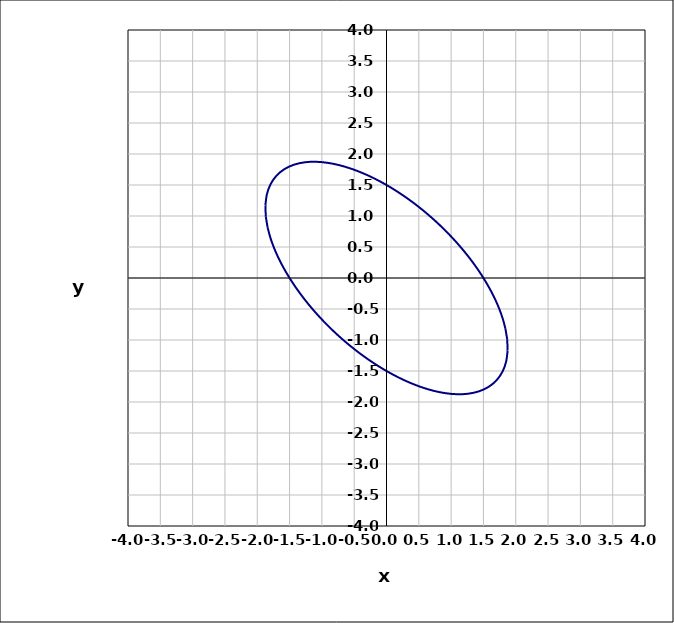
| Category | Series 0 |
|---|---|
| -1.5 | 0 |
| -1.4375296708838468 | -0.101 |
| -1.3759726592313735 | -0.193 |
| -1.3154614762220582 | -0.28 |
| -1.2559812963288002 | -0.36 |
| -1.1974207125813492 | -0.436 |
| -1.1396047764158042 | -0.507 |
| -1.0823158098177954 | -0.575 |
| -1.025305845069098 | -0.641 |
| -0.9683033154098408 | -0.704 |
| -0.9110157381139717 | -0.764 |
| -0.8531295177181576 | -0.824 |
| -0.7943075762747245 | -0.882 |
| -0.734185231992017 | -0.94 |
| -0.6723645581132973 | -0.997 |
| -0.6084073372144457 | -1.054 |
| -0.5418266741284669 | -1.111 |
| -0.4720773513411672 | -1.168 |
| -0.3985451323405249 | -1.227 |
| -0.3205354991529524 | -1.286 |
| -0.2372628539007267 | -1.346 |
| -0.14784219442304192 | -1.407 |
| -0.051286966853242105 | -1.469 |
| 0.0534803882307044 | -1.531 |
| 0.16759421525226637 | -1.595 |
| 0.29217016235656695 | -1.657 |
| 0.4281622210538621 | -1.717 |
| 0.5761175990471608 | -1.773 |
| 0.7357937001626735 | -1.821 |
| 0.9056245298947232 | -1.857 |
| 1.08209814824469 | -1.874 |
| 1.259253721782433 | -1.867 |
| 1.4286876570793925 | -1.829 |
| 1.580502243911449 | -1.755 |
| 1.7052852031563746 | -1.647 |
| 1.796479804291017 | -1.507 |
| 1.8519746273673354 | -1.346 |
| 1.874094672721266 | -1.171 |
| 1.8682056618292284 | -0.993 |
| 1.8408661457303344 | -0.82 |
| 1.7983620133446403 | -0.655 |
| 1.7459238017602403 | -0.501 |
| 1.6875117882298993 | -0.359 |
| 1.6259241010904195 | -0.229 |
| 1.563027895396554 | -0.109 |
| 1.5 | 0 |
| 1.437529670883847 | 0.101 |
| 1.3759726592313735 | 0.193 |
| 1.3154614762220582 | 0.28 |
| 1.2559812963288002 | 0.36 |
| 1.1974207125813492 | 0.436 |
| 1.1396047764158037 | 0.507 |
| 1.0823158098177954 | 0.575 |
| 1.025305845069098 | 0.641 |
| 0.9683033154098412 | 0.704 |
| 0.9110157381139719 | 0.764 |
| 0.8531295177181577 | 0.824 |
| 0.7943075762747248 | 0.882 |
| 0.734185231992017 | 0.94 |
| 0.6723645581132974 | 0.997 |
| 0.6084073372144461 | 1.054 |
| 0.5418266741284669 | 1.111 |
| 0.4720773513411673 | 1.168 |
| 0.39854513234052513 | 1.227 |
| 0.32053549915295243 | 1.286 |
| 0.23726285390072682 | 1.346 |
| 0.14784219442304206 | 1.407 |
| 0.051286966853242605 | 1.469 |
| -0.053480388230703856 | 1.531 |
| -0.1675942152522662 | 1.595 |
| -0.2921701623565668 | 1.657 |
| -0.4281622210538619 | 1.717 |
| -0.5761175990471605 | 1.773 |
| -0.7357937001626732 | 1.821 |
| -0.9056245298947235 | 1.857 |
| -1.082098148244689 | 1.874 |
| -1.2592537217824322 | 1.867 |
| -1.428687657079393 | 1.829 |
| -1.580502243911448 | 1.755 |
| -1.705285203156374 | 1.647 |
| -1.7964798042910168 | 1.507 |
| -1.8519746273673352 | 1.346 |
| -1.874094672721266 | 1.171 |
| -1.868205661829228 | 0.993 |
| -1.840866145730335 | 0.82 |
| -1.7983620133446405 | 0.655 |
| -1.7459238017602403 | 0.501 |
| -1.6875117882298993 | 0.359 |
| -1.6259241010904193 | 0.229 |
| -1.5630278953965542 | 0.109 |
| -1.5 | 0 |